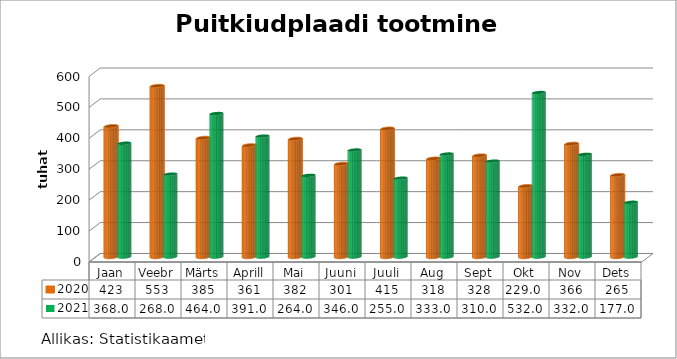
| Category | 2020 | 2021 |
|---|---|---|
| Jaan | 423 | 368 |
| Veebr | 553 | 268 |
| Märts | 385 | 464 |
| Aprill | 361 | 391 |
| Mai | 382 | 264 |
| Juuni | 301 | 346 |
| Juuli | 415 | 255 |
| Aug | 318 | 333 |
| Sept | 328 | 310 |
| Okt | 229 | 532 |
| Nov | 366 | 332 |
| Dets | 265 | 177 |